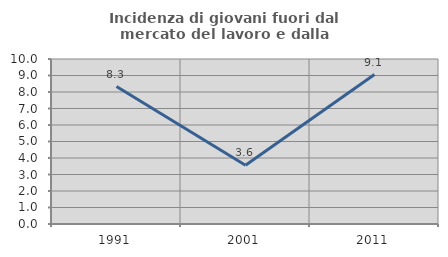
| Category | Incidenza di giovani fuori dal mercato del lavoro e dalla formazione  |
|---|---|
| 1991.0 | 8.333 |
| 2001.0 | 3.559 |
| 2011.0 | 9.058 |